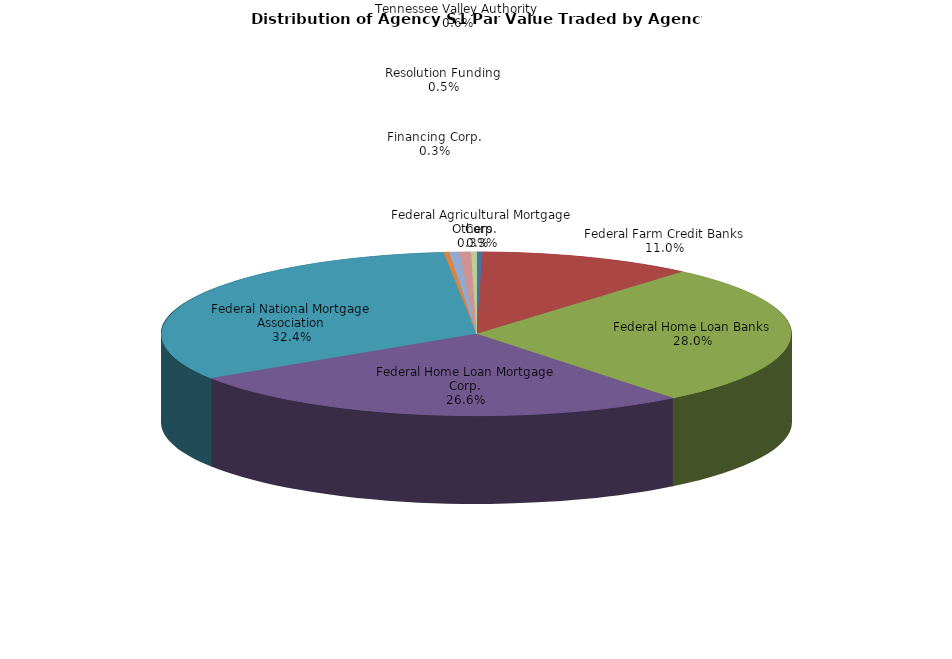
| Category | Series 0 |
|---|---|
| Federal Agricultural Mortgage Corp. | 21990996.016 |
| Federal Farm Credit Banks | 800520394.422 |
| Federal Home Loan Banks | 2043643031.47 |
| Federal Home Loan Mortgage Corp. | 1936423761.341 |
| Federal National Mortgage Association | 2365303849.833 |
| Financing Corp. | 20551819.323 |
| Resolution Funding | 38499373.108 |
| Tennessee Valley Authority | 41722659.619 |
| Others | 20613570.74 |